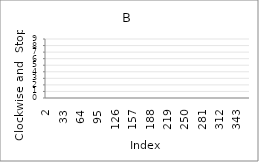
| Category | Series 0 |
|---|---|
| 2.0 | 6 |
| 3.0 | 7 |
| 4.0 | 9 |
| 5.0 | 5 |
| 6.0 | 1 |
| 7.0 | 3 |
| 8.0 | 4 |
| 9.0 | 4 |
| 10.0 | 3 |
| 11.0 | 3 |
| 12.0 | 5 |
| 13.0 | 1 |
| 14.0 | 3 |
| 15.0 | 8 |
| 16.0 | 1 |
| 17.0 | 4 |
| 18.0 | 7 |
| 19.0 | 7 |
| 20.0 | 3 |
| 21.0 | 4 |
| 22.0 | 0 |
| 23.0 | 3 |
| 24.0 | 4 |
| 25.0 | 2 |
| 26.0 | 8 |
| 27.0 | 1 |
| 28.0 | 2 |
| 29.0 | 7 |
| 30.0 | 1 |
| 31.0 | 99 |
| 32.0 | 99 |
| 33.0 | 99 |
| 34.0 | 99 |
| 35.0 | 99 |
| 36.0 | 99 |
| 37.0 | 99 |
| 38.0 | 99 |
| 39.0 | 99 |
| 40.0 | 99 |
| 41.0 | 99 |
| 42.0 | 99 |
| 43.0 | 99 |
| 44.0 | 99 |
| 45.0 | 99 |
| 46.0 | 99 |
| 47.0 | 99 |
| 48.0 | 99 |
| 49.0 | 99 |
| 50.0 | 99 |
| 51.0 | 99 |
| 52.0 | 99 |
| 53.0 | 99 |
| 54.0 | 99 |
| 55.0 | 99 |
| 56.0 | 99 |
| 57.0 | 99 |
| 58.0 | 99 |
| 59.0 | 99 |
| 60.0 | 99 |
| 61.0 | 99 |
| 62.0 | 99 |
| 63.0 | 99 |
| 64.0 | 99 |
| 65.0 | 99 |
| 66.0 | 99 |
| 67.0 | 99 |
| 68.0 | 99 |
| 69.0 | 99 |
| 70.0 | 99 |
| 71.0 | 99 |
| 72.0 | 99 |
| 73.0 | 99 |
| 74.0 | 99 |
| 75.0 | 99 |
| 76.0 | 99 |
| 77.0 | 99 |
| 78.0 | 99 |
| 79.0 | 99 |
| 80.0 | 99 |
| 81.0 | 99 |
| 82.0 | 99 |
| 83.0 | 99 |
| 84.0 | 99 |
| 85.0 | 99 |
| 86.0 | 99 |
| 87.0 | 99 |
| 88.0 | 99 |
| 89.0 | 99 |
| 90.0 | 99 |
| 91.0 | 99 |
| 92.0 | 99 |
| 93.0 | 99 |
| 94.0 | 99 |
| 95.0 | 99 |
| 96.0 | 99 |
| 97.0 | 99 |
| 98.0 | 99 |
| 99.0 | 99 |
| 100.0 | 99 |
| 101.0 | 99 |
| 102.0 | 99 |
| 103.0 | 99 |
| 104.0 | 99 |
| 105.0 | 99 |
| 106.0 | 99 |
| 107.0 | 99 |
| 108.0 | 99 |
| 109.0 | 99 |
| 110.0 | 99 |
| 111.0 | 99 |
| 112.0 | 99 |
| 113.0 | 99 |
| 114.0 | 99 |
| 115.0 | 99 |
| 116.0 | 99 |
| 117.0 | 99 |
| 118.0 | 99 |
| 119.0 | 99 |
| 120.0 | 99 |
| 121.0 | 99 |
| 122.0 | 99 |
| 123.0 | 99 |
| 124.0 | 99 |
| 125.0 | 99 |
| 126.0 | 99 |
| 127.0 | 99 |
| 128.0 | 99 |
| 129.0 | 99 |
| 130.0 | 99 |
| 131.0 | 99 |
| 132.0 | 99 |
| 133.0 | 99 |
| 134.0 | 99 |
| 135.0 | 99 |
| 136.0 | 99 |
| 137.0 | 99 |
| 138.0 | 99 |
| 139.0 | 99 |
| 140.0 | 99 |
| 141.0 | 99 |
| 142.0 | 99 |
| 143.0 | 99 |
| 144.0 | 99 |
| 145.0 | 99 |
| 146.0 | 99 |
| 147.0 | 99 |
| 148.0 | 99 |
| 149.0 | 99 |
| 150.0 | 99 |
| 151.0 | 99 |
| 152.0 | 99 |
| 153.0 | 99 |
| 154.0 | 99 |
| 155.0 | 99 |
| 156.0 | 99 |
| 157.0 | 99 |
| 158.0 | 99 |
| 159.0 | 99 |
| 160.0 | 99 |
| 161.0 | 99 |
| 162.0 | 99 |
| 163.0 | 99 |
| 164.0 | 99 |
| 165.0 | 99 |
| 166.0 | 99 |
| 167.0 | 99 |
| 168.0 | 99 |
| 169.0 | 99 |
| 170.0 | 99 |
| 171.0 | 99 |
| 172.0 | 99 |
| 173.0 | 99 |
| 174.0 | 99 |
| 175.0 | 99 |
| 176.0 | 99 |
| 177.0 | 99 |
| 178.0 | 99 |
| 179.0 | 99 |
| 180.0 | 99 |
| 181.0 | 99 |
| 182.0 | 99 |
| 183.0 | 99 |
| 184.0 | 99 |
| 185.0 | 99 |
| 186.0 | 99 |
| 187.0 | 99 |
| 188.0 | 99 |
| 189.0 | 99 |
| 190.0 | 99 |
| 191.0 | 99 |
| 192.0 | 99 |
| 193.0 | 99 |
| 194.0 | 99 |
| 195.0 | 99 |
| 196.0 | 99 |
| 197.0 | 99 |
| 198.0 | 99 |
| 199.0 | 99 |
| 200.0 | 99 |
| 201.0 | 99 |
| 202.0 | 99 |
| 203.0 | 99 |
| 204.0 | 99 |
| 205.0 | 99 |
| 206.0 | 99 |
| 207.0 | 99 |
| 208.0 | 99 |
| 209.0 | 99 |
| 210.0 | 99 |
| 211.0 | 99 |
| 212.0 | 99 |
| 213.0 | 99 |
| 214.0 | 99 |
| 215.0 | 99 |
| 216.0 | 99 |
| 217.0 | 99 |
| 218.0 | 99 |
| 219.0 | 99 |
| 220.0 | 99 |
| 221.0 | 99 |
| 222.0 | 99 |
| 223.0 | 99 |
| 224.0 | 99 |
| 225.0 | 99 |
| 226.0 | 99 |
| 227.0 | 99 |
| 228.0 | 99 |
| 229.0 | 99 |
| 230.0 | 99 |
| 231.0 | 99 |
| 232.0 | 99 |
| 233.0 | 99 |
| 234.0 | 99 |
| 235.0 | 99 |
| 236.0 | 99 |
| 237.0 | 99 |
| 238.0 | 99 |
| 239.0 | 99 |
| 240.0 | 99 |
| 241.0 | 99 |
| 242.0 | 99 |
| 243.0 | 99 |
| 244.0 | 99 |
| 245.0 | 99 |
| 246.0 | 99 |
| 247.0 | 99 |
| 248.0 | 99 |
| 249.0 | 99 |
| 250.0 | 99 |
| 251.0 | 99 |
| 252.0 | 99 |
| 253.0 | 99 |
| 254.0 | 99 |
| 255.0 | 99 |
| 256.0 | 99 |
| 257.0 | 99 |
| 258.0 | 99 |
| 259.0 | 99 |
| 260.0 | 99 |
| 261.0 | 99 |
| 262.0 | 99 |
| 263.0 | 99 |
| 264.0 | 99 |
| 265.0 | 99 |
| 266.0 | 99 |
| 267.0 | 99 |
| 268.0 | 99 |
| 269.0 | 99 |
| 270.0 | 99 |
| 271.0 | 99 |
| 272.0 | 99 |
| 273.0 | 99 |
| 274.0 | 99 |
| 275.0 | 99 |
| 276.0 | 99 |
| 277.0 | 99 |
| 278.0 | 99 |
| 279.0 | 99 |
| 280.0 | 99 |
| 281.0 | 99 |
| 282.0 | 99 |
| 283.0 | 99 |
| 284.0 | 99 |
| 285.0 | 99 |
| 286.0 | 99 |
| 287.0 | 99 |
| 288.0 | 99 |
| 289.0 | 99 |
| 290.0 | 99 |
| 291.0 | 99 |
| 292.0 | 99 |
| 293.0 | 99 |
| 294.0 | 99 |
| 295.0 | 99 |
| 296.0 | 99 |
| 297.0 | 99 |
| 298.0 | 99 |
| 299.0 | 99 |
| 300.0 | 99 |
| 301.0 | 99 |
| 302.0 | 99 |
| 303.0 | 99 |
| 304.0 | 99 |
| 305.0 | 99 |
| 306.0 | 99 |
| 307.0 | 99 |
| 308.0 | 99 |
| 309.0 | 99 |
| 310.0 | 99 |
| 311.0 | 99 |
| 312.0 | 99 |
| 313.0 | 99 |
| 314.0 | 99 |
| 315.0 | 99 |
| 316.0 | 99 |
| 317.0 | 99 |
| 318.0 | 99 |
| 319.0 | 99 |
| 320.0 | 99 |
| 321.0 | 99 |
| 322.0 | 99 |
| 323.0 | 99 |
| 324.0 | 99 |
| 325.0 | 99 |
| 326.0 | 99 |
| 327.0 | 99 |
| 328.0 | 99 |
| 329.0 | 99 |
| 330.0 | 99 |
| 331.0 | 99 |
| 332.0 | 99 |
| 333.0 | 99 |
| 334.0 | 99 |
| 335.0 | 99 |
| 336.0 | 99 |
| 337.0 | 99 |
| 338.0 | 99 |
| 339.0 | 99 |
| 340.0 | 99 |
| 341.0 | 99 |
| 342.0 | 99 |
| 343.0 | 99 |
| 344.0 | 99 |
| 345.0 | 99 |
| 346.0 | 99 |
| 347.0 | 99 |
| 348.0 | 99 |
| 349.0 | 99 |
| 350.0 | 99 |
| 351.0 | 99 |
| 352.0 | 99 |
| 353.0 | 99 |
| 354.0 | 99 |
| 355.0 | 99 |
| 356.0 | 99 |
| 357.0 | 99 |
| 358.0 | 99 |
| 359.0 | 99 |
| 360.0 | 99 |
| 361.0 | 99 |
| 362.0 | 99 |
| 363.0 | 99 |
| 364.0 | 99 |
| 365.0 | 99 |